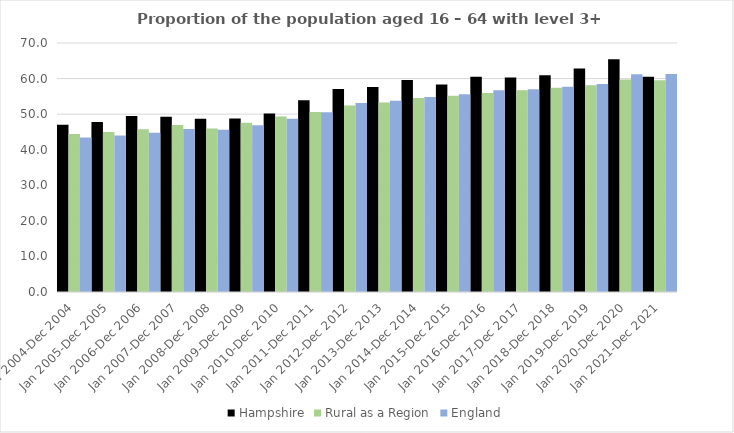
| Category | Hampshire | Rural as a Region | England |
|---|---|---|---|
| Jan 2004-Dec 2004 | 47 | 44.405 | 43.4 |
| Jan 2005-Dec 2005 | 47.8 | 44.973 | 44 |
| Jan 2006-Dec 2006 | 49.5 | 45.774 | 44.8 |
| Jan 2007-Dec 2007 | 49.3 | 46.968 | 45.8 |
| Jan 2008-Dec 2008 | 48.7 | 45.964 | 45.6 |
| Jan 2009-Dec 2009 | 48.8 | 47.59 | 46.9 |
| Jan 2010-Dec 2010 | 50.2 | 49.362 | 48.7 |
| Jan 2011-Dec 2011 | 53.9 | 50.602 | 50.5 |
| Jan 2012-Dec 2012 | 57.1 | 52.439 | 53.1 |
| Jan 2013-Dec 2013 | 57.6 | 53.276 | 53.8 |
| Jan 2014-Dec 2014 | 59.6 | 54.57 | 54.8 |
| Jan 2015-Dec 2015 | 58.3 | 55.16 | 55.6 |
| Jan 2016-Dec 2016 | 60.5 | 55.941 | 56.7 |
| Jan 2017-Dec 2017 | 60.3 | 56.689 | 57 |
| Jan 2018-Dec 2018 | 60.9 | 57.389 | 57.7 |
| Jan 2019-Dec 2019 | 62.8 | 58.147 | 58.5 |
| Jan 2020-Dec 2020 | 65.4 | 59.771 | 61.2 |
| Jan 2021-Dec 2021 | 60.5 | 59.54 | 61.3 |